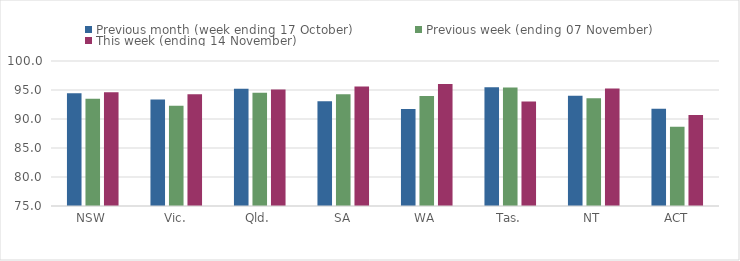
| Category | Previous month (week ending 17 October) | Previous week (ending 07 November) | This week (ending 14 November) |
|---|---|---|---|
| NSW | 94.44 | 93.5 | 94.62 |
| Vic. | 93.36 | 92.28 | 94.27 |
| Qld. | 95.21 | 94.54 | 95.07 |
| SA | 93.08 | 94.25 | 95.6 |
| WA | 91.74 | 93.97 | 96.02 |
| Tas. | 95.46 | 95.43 | 93.01 |
| NT | 93.99 | 93.58 | 95.24 |
| ACT | 91.75 | 88.66 | 90.71 |